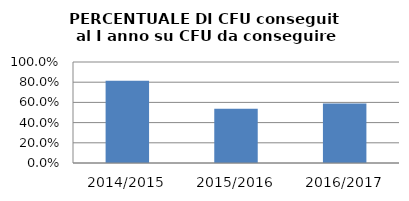
| Category | 2014/2015 2015/2016 2016/2017 |
|---|---|
| 2014/2015 | 0.815 |
| 2015/2016 | 0.537 |
| 2016/2017 | 0.588 |